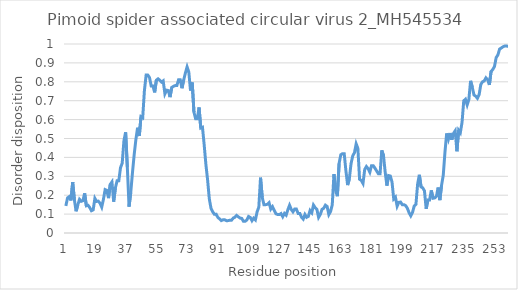
| Category | Series 0 |
|---|---|
| 0 | 0.143 |
| 1 | 0.186 |
| 2 | 0.192 |
| 3 | 0.172 |
| 4 | 0.269 |
| 5 | 0.176 |
| 6 | 0.115 |
| 7 | 0.149 |
| 8 | 0.178 |
| 9 | 0.168 |
| 10 | 0.171 |
| 11 | 0.21 |
| 12 | 0.144 |
| 13 | 0.147 |
| 14 | 0.134 |
| 15 | 0.118 |
| 16 | 0.122 |
| 17 | 0.183 |
| 18 | 0.167 |
| 19 | 0.169 |
| 20 | 0.158 |
| 21 | 0.137 |
| 22 | 0.178 |
| 23 | 0.23 |
| 24 | 0.226 |
| 25 | 0.185 |
| 26 | 0.257 |
| 27 | 0.27 |
| 28 | 0.166 |
| 29 | 0.239 |
| 30 | 0.276 |
| 31 | 0.276 |
| 32 | 0.345 |
| 33 | 0.369 |
| 34 | 0.488 |
| 35 | 0.533 |
| 36 | 0.348 |
| 37 | 0.139 |
| 38 | 0.213 |
| 39 | 0.318 |
| 40 | 0.413 |
| 41 | 0.494 |
| 42 | 0.557 |
| 43 | 0.513 |
| 44 | 0.616 |
| 45 | 0.61 |
| 46 | 0.753 |
| 47 | 0.835 |
| 48 | 0.835 |
| 49 | 0.822 |
| 50 | 0.778 |
| 51 | 0.778 |
| 52 | 0.744 |
| 53 | 0.808 |
| 54 | 0.816 |
| 55 | 0.808 |
| 56 | 0.799 |
| 57 | 0.805 |
| 58 | 0.736 |
| 59 | 0.756 |
| 60 | 0.754 |
| 61 | 0.719 |
| 62 | 0.77 |
| 63 | 0.776 |
| 64 | 0.78 |
| 65 | 0.78 |
| 66 | 0.811 |
| 67 | 0.811 |
| 68 | 0.766 |
| 69 | 0.809 |
| 70 | 0.847 |
| 71 | 0.879 |
| 72 | 0.852 |
| 73 | 0.754 |
| 74 | 0.796 |
| 75 | 0.64 |
| 76 | 0.604 |
| 77 | 0.604 |
| 78 | 0.664 |
| 79 | 0.556 |
| 80 | 0.56 |
| 81 | 0.467 |
| 82 | 0.363 |
| 83 | 0.281 |
| 84 | 0.181 |
| 85 | 0.131 |
| 86 | 0.112 |
| 87 | 0.099 |
| 88 | 0.1 |
| 89 | 0.083 |
| 90 | 0.075 |
| 91 | 0.066 |
| 92 | 0.07 |
| 93 | 0.07 |
| 94 | 0.065 |
| 95 | 0.065 |
| 96 | 0.068 |
| 97 | 0.068 |
| 98 | 0.079 |
| 99 | 0.083 |
| 100 | 0.093 |
| 101 | 0.086 |
| 102 | 0.079 |
| 103 | 0.077 |
| 104 | 0.062 |
| 105 | 0.062 |
| 106 | 0.069 |
| 107 | 0.087 |
| 108 | 0.082 |
| 109 | 0.065 |
| 110 | 0.079 |
| 111 | 0.07 |
| 112 | 0.112 |
| 113 | 0.137 |
| 114 | 0.293 |
| 115 | 0.189 |
| 116 | 0.15 |
| 117 | 0.15 |
| 118 | 0.152 |
| 119 | 0.16 |
| 120 | 0.127 |
| 121 | 0.139 |
| 122 | 0.12 |
| 123 | 0.102 |
| 124 | 0.098 |
| 125 | 0.097 |
| 126 | 0.103 |
| 127 | 0.086 |
| 128 | 0.104 |
| 129 | 0.094 |
| 130 | 0.123 |
| 131 | 0.147 |
| 132 | 0.125 |
| 133 | 0.112 |
| 134 | 0.126 |
| 135 | 0.127 |
| 136 | 0.104 |
| 137 | 0.104 |
| 138 | 0.084 |
| 139 | 0.074 |
| 140 | 0.098 |
| 141 | 0.083 |
| 142 | 0.088 |
| 143 | 0.119 |
| 144 | 0.107 |
| 145 | 0.148 |
| 146 | 0.134 |
| 147 | 0.125 |
| 148 | 0.083 |
| 149 | 0.099 |
| 150 | 0.125 |
| 151 | 0.131 |
| 152 | 0.147 |
| 153 | 0.14 |
| 154 | 0.097 |
| 155 | 0.113 |
| 156 | 0.149 |
| 157 | 0.312 |
| 158 | 0.224 |
| 159 | 0.195 |
| 160 | 0.368 |
| 161 | 0.414 |
| 162 | 0.42 |
| 163 | 0.42 |
| 164 | 0.329 |
| 165 | 0.253 |
| 166 | 0.286 |
| 167 | 0.367 |
| 168 | 0.408 |
| 169 | 0.425 |
| 170 | 0.472 |
| 171 | 0.448 |
| 172 | 0.285 |
| 173 | 0.278 |
| 174 | 0.262 |
| 175 | 0.336 |
| 176 | 0.352 |
| 177 | 0.341 |
| 178 | 0.322 |
| 179 | 0.356 |
| 180 | 0.356 |
| 181 | 0.343 |
| 182 | 0.328 |
| 183 | 0.314 |
| 184 | 0.314 |
| 185 | 0.437 |
| 186 | 0.41 |
| 187 | 0.321 |
| 188 | 0.251 |
| 189 | 0.304 |
| 190 | 0.302 |
| 191 | 0.269 |
| 192 | 0.18 |
| 193 | 0.19 |
| 194 | 0.142 |
| 195 | 0.162 |
| 196 | 0.164 |
| 197 | 0.15 |
| 198 | 0.15 |
| 199 | 0.145 |
| 200 | 0.131 |
| 201 | 0.107 |
| 202 | 0.091 |
| 203 | 0.109 |
| 204 | 0.143 |
| 205 | 0.151 |
| 206 | 0.26 |
| 207 | 0.308 |
| 208 | 0.244 |
| 209 | 0.239 |
| 210 | 0.223 |
| 211 | 0.128 |
| 212 | 0.174 |
| 213 | 0.174 |
| 214 | 0.225 |
| 215 | 0.184 |
| 216 | 0.186 |
| 217 | 0.193 |
| 218 | 0.241 |
| 219 | 0.174 |
| 220 | 0.252 |
| 221 | 0.305 |
| 222 | 0.428 |
| 223 | 0.527 |
| 224 | 0.495 |
| 225 | 0.529 |
| 226 | 0.493 |
| 227 | 0.527 |
| 228 | 0.541 |
| 229 | 0.432 |
| 230 | 0.543 |
| 231 | 0.531 |
| 232 | 0.585 |
| 233 | 0.699 |
| 234 | 0.708 |
| 235 | 0.678 |
| 236 | 0.706 |
| 237 | 0.805 |
| 238 | 0.771 |
| 239 | 0.73 |
| 240 | 0.724 |
| 241 | 0.713 |
| 242 | 0.732 |
| 243 | 0.786 |
| 244 | 0.8 |
| 245 | 0.805 |
| 246 | 0.821 |
| 247 | 0.812 |
| 248 | 0.783 |
| 249 | 0.855 |
| 250 | 0.865 |
| 251 | 0.881 |
| 252 | 0.929 |
| 253 | 0.942 |
| 254 | 0.973 |
| 255 | 0.979 |
| 256 | 0.985 |
| 257 | 0.989 |
| 258 | 0.99 |
| 259 | 0.986 |